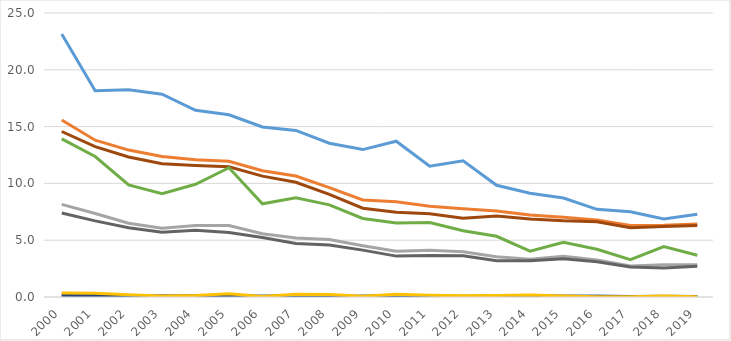
| Category | total NFDL | total NDL | sur NFDL | sur NDL | ug NFDL | ug NDL |
|---|---|---|---|---|---|---|
| 2000.0 | 15.575 | 8.158 | 14.568 | 7.394 | 23.151 | 13.914 |
| 2001.0 | 13.806 | 7.35 | 13.239 | 6.698 | 18.164 | 12.364 |
| 2002.0 | 12.934 | 6.486 | 12.324 | 6.099 | 18.247 | 9.862 |
| 2003.0 | 12.366 | 6.057 | 11.738 | 5.71 | 17.857 | 9.097 |
| 2004.0 | 12.088 | 6.3 | 11.578 | 5.875 | 16.434 | 9.922 |
| 2005.0 | 11.953 | 6.286 | 11.458 | 5.67 | 16.043 | 11.377 |
| 2006.0 | 11.119 | 5.566 | 10.64 | 5.238 | 14.971 | 8.204 |
| 2007.0 | 10.648 | 5.201 | 10.099 | 4.716 | 14.662 | 8.743 |
| 2008.0 | 9.63 | 5.053 | 9.027 | 4.579 | 13.534 | 8.114 |
| 2009.0 | 8.541 | 4.515 | 7.818 | 4.125 | 12.977 | 6.911 |
| 2010.0 | 8.377 | 4.029 | 7.452 | 3.599 | 13.713 | 6.509 |
| 2011.0 | 7.992 | 4.109 | 7.335 | 3.654 | 11.52 | 6.557 |
| 2012.0 | 7.758 | 3.99 | 6.927 | 3.628 | 11.995 | 5.835 |
| 2013.0 | 7.568 | 3.541 | 7.124 | 3.188 | 9.836 | 5.345 |
| 2014.0 | 7.226 | 3.32 | 6.867 | 3.186 | 9.127 | 4.028 |
| 2015.0 | 7.023 | 3.59 | 6.707 | 3.362 | 8.714 | 4.813 |
| 2016.0 | 6.787 | 3.269 | 6.629 | 3.109 | 7.716 | 4.206 |
| 2017.0 | 6.304 | 2.726 | 6.101 | 2.632 | 7.509 | 3.285 |
| 2018.0 | 6.311 | 2.83 | 6.214 | 2.554 | 6.875 | 4.44 |
| 2019.0 | 6.431 | 2.841 | 6.285 | 2.7 | 7.287 | 3.672 |